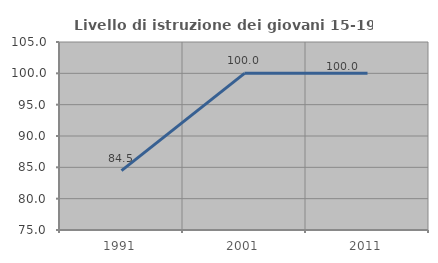
| Category | Livello di istruzione dei giovani 15-19 anni |
|---|---|
| 1991.0 | 84.483 |
| 2001.0 | 100 |
| 2011.0 | 100 |